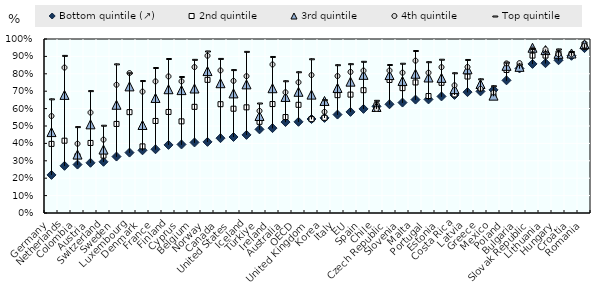
| Category | Bottom quintile (↗) | 2nd quintile | 3rd quintile | 4th quintile | Top quintile |
|---|---|---|---|---|---|
| Germany | 0.219 | 0.397 | 0.465 | 0.557 | 0.656 |
| Netherlands | 0.271 | 0.416 | 0.679 | 0.836 | 0.906 |
| Colombia | 0.278 | 0.327 | 0.336 | 0.398 | 0.497 |
| Austria | 0.289 | 0.403 | 0.51 | 0.577 | 0.703 |
| Switzerland | 0.294 | 0.33 | 0.365 | 0.422 | 0.504 |
| Sweden | 0.324 | 0.512 | 0.622 | 0.737 | 0.857 |
| Luxembourg | 0.347 | 0.58 | 0.728 | 0.804 | 0.806 |
| Denmark | 0.36 | 0.383 | 0.506 | 0.698 | 0.761 |
| France | 0.366 | 0.529 | 0.661 | 0.757 | 0.836 |
| Finland | 0.391 | 0.581 | 0.711 | 0.785 | 0.888 |
| Cyprus | 0.394 | 0.527 | 0.706 | 0.757 | 0.784 |
| Belgium | 0.405 | 0.61 | 0.716 | 0.839 | 0.883 |
| Norway | 0.409 | 0.765 | 0.816 | 0.904 | 0.931 |
| Canada | 0.43 | 0.625 | 0.746 | 0.82 | 0.888 |
| United States | 0.437 | 0.599 | 0.687 | 0.759 | 0.824 |
| Iceland | 0.449 | 0.607 | 0.739 | 0.786 | 0.929 |
| Türkiye | 0.481 | 0.524 | 0.558 | 0.587 | 0.632 |
| Ireland | 0.488 | 0.626 | 0.717 | 0.854 | 0.9 |
| Australia | 0.523 | 0.551 | 0.667 | 0.694 | 0.76 |
| OECD | 0.524 | 0.622 | 0.697 | 0.751 | 0.812 |
| United Kingdom | 0.54 | 0.539 | 0.68 | 0.793 | 0.886 |
| Korea | 0.546 | 0.547 | 0.644 | 0.581 | 0.651 |
| Italy | 0.566 | 0.677 | 0.719 | 0.787 | 0.852 |
| EU | 0.581 | 0.68 | 0.755 | 0.811 | 0.858 |
| Spain | 0.598 | 0.706 | 0.794 | 0.818 | 0.872 |
| Chile | 0.613 | 0.619 | 0.609 | 0.598 | 0.648 |
| Czech Republic | 0.625 | 0.765 | 0.793 | 0.819 | 0.853 |
| Slovenia | 0.635 | 0.718 | 0.759 | 0.806 | 0.861 |
| Malta | 0.652 | 0.75 | 0.8 | 0.875 | 0.934 |
| Portugal | 0.653 | 0.672 | 0.779 | 0.806 | 0.87 |
| Estonia | 0.67 | 0.748 | 0.777 | 0.838 | 0.884 |
| Costa Rica | 0.678 | 0.681 | 0.712 | 0.734 | 0.806 |
| Latvia | 0.695 | 0.784 | 0.826 | 0.839 | 0.882 |
| Greece | 0.699 | 0.718 | 0.741 | 0.714 | 0.771 |
| Mexico | 0.708 | 0.671 | 0.674 | 0.692 | 0.732 |
| Poland | 0.762 | 0.822 | 0.846 | 0.86 | 0.867 |
| Bulgaria | 0.831 | 0.84 | 0.84 | 0.862 | 0.855 |
| Slovak Republic | 0.857 | 0.905 | 0.95 | 0.939 | 0.946 |
| Lithuania | 0.861 | 0.905 | 0.936 | 0.94 | 0.925 |
| Hungary | 0.878 | 0.917 | 0.915 | 0.912 | 0.943 |
| Croatia | 0.904 | 0.913 | 0.917 | 0.912 | 0.928 |
| Romania | 0.948 | 0.969 | 0.97 | 0.96 | 0.946 |